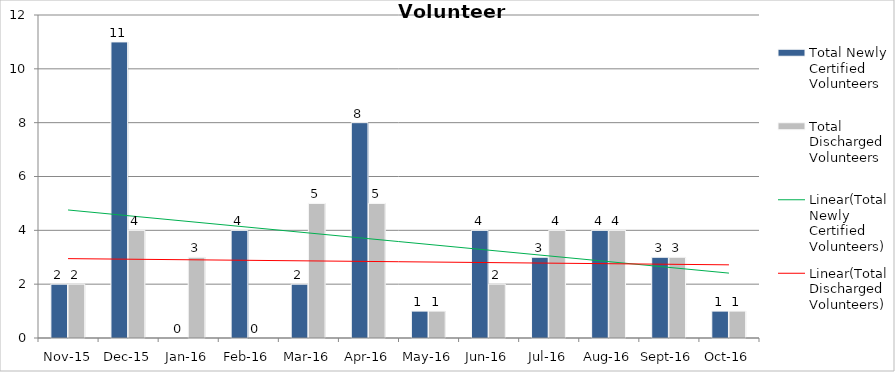
| Category | Total Newly Certified Volunteers | Total Discharged Volunteers |
|---|---|---|
| Nov-15 | 2 | 2 |
| Dec-15 | 11 | 4 |
| Jan-16 | 0 | 3 |
| Feb-16 | 4 | 0 |
| Mar-16 | 2 | 5 |
| Apr-16 | 8 | 5 |
| May-16 | 1 | 1 |
| Jun-16 | 4 | 2 |
| Jul-16 | 3 | 4 |
| Aug-16 | 4 | 4 |
| Sep-16 | 3 | 3 |
| Oct-16 | 1 | 1 |